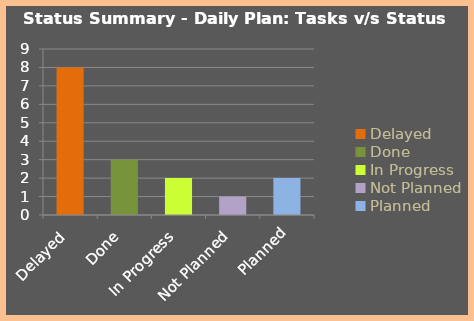
| Category | Total |
|---|---|
| Delayed | 8 |
| Done | 3 |
| In Progress | 2 |
| Not Planned | 1 |
| Planned | 2 |